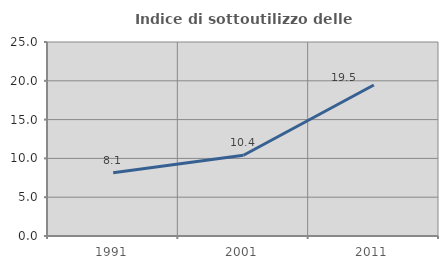
| Category | Indice di sottoutilizzo delle abitazioni  |
|---|---|
| 1991.0 | 8.14 |
| 2001.0 | 10.403 |
| 2011.0 | 19.462 |